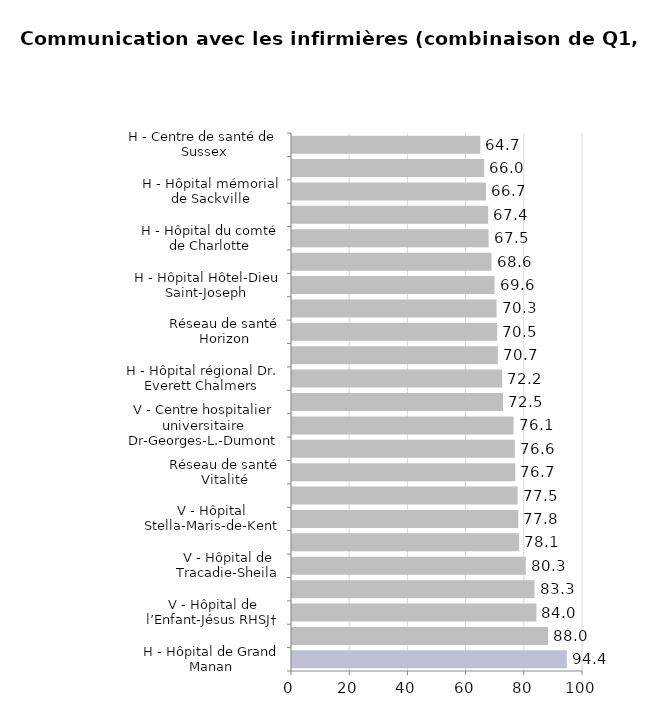
| Category | Total |
|---|---|
| H - Hôpital de Grand Manan | 94.444 |
| V - Hôtel-Dieu Saint-Joseph de Saint-Quentin | 88 |
| V - Hôpital de l’Enfant-Jésus RHSJ† | 84 |
| V - Hôpital général de Grand-Sault | 83.333 |
| V - Hôpital de Tracadie-Sheila | 80.323 |
| H - Hôpital régional de Miramichi | 78.063 |
| V - Hôpital Stella-Maris-de-Kent | 77.778 |
| V - Hôpital régional Chaleur | 77.521 |
| Réseau de santé Vitalité | 76.719 |
| V - Hôpital régional d’Edmundston | 76.573 |
| V - Centre hospitalier universitaire Dr-Georges-L.-Dumont | 76.141 |
| Nouveau-Brunswick | 72.518 |
| H - Hôpital régional Dr. Everett Chalmers | 72.234 |
| V - Hôpital Régional de Campbellton | 70.724 |
| Réseau de santé Horizon | 70.489 |
| H - L’hôpital de Moncton | 70.302 |
| H - Hôpital Hôtel-Dieu Saint-Joseph | 69.6 |
| H - Hôpital régional de Saint John | 68.564 |
| H - Hôpital du comté de Charlotte | 67.544 |
| H - Hôpital public d’Oromocto | 67.424 |
| H - Hôpital mémorial de Sackville | 66.667 |
| H - Hôpital du Haut de la Vallée | 66.048 |
| H - Centre de santé de Sussex | 64.706 |